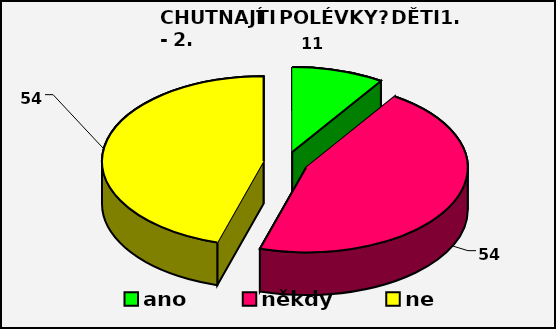
| Category | Series 0 |
|---|---|
| ano | 11 |
| někdy | 54 |
| ne | 54 |